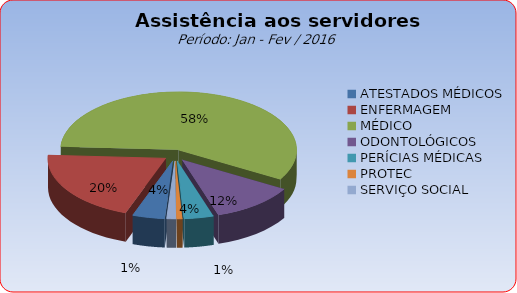
| Category | Series 0 |
|---|---|
| ATESTADOS MÉDICOS | 4.419 |
| ENFERMAGEM | 20.328 |
| MÉDICO | 57.576 |
| ODONTOLÓGICOS | 11.616 |
| PERÍCIAS MÉDICAS | 4.04 |
| PROTEC | 0.758 |
| SERVIÇO SOCIAL | 1.263 |